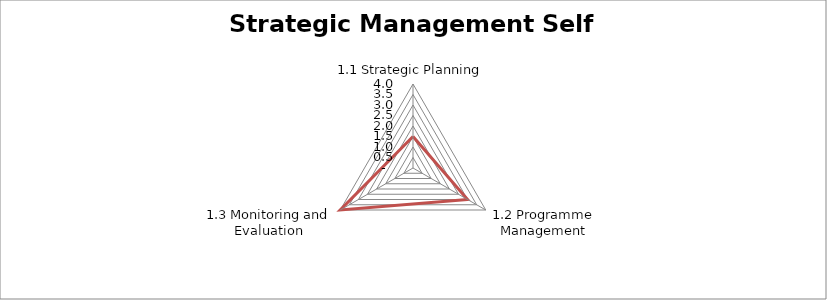
| Category | Secondary data analysis | Self assess |
|---|---|---|
| 1.1 Strategic Planning |  | 1.5 |
| 1.2 Programme Management |  | 3 |
| 1.3 Monitoring and Evaluation |  | 4 |